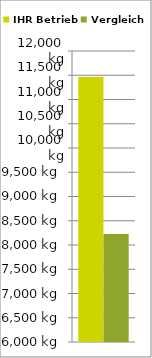
| Category | IHR Betrieb | Vergleich |
|---|---|---|
| 0 | 11461.675 | 8228 |